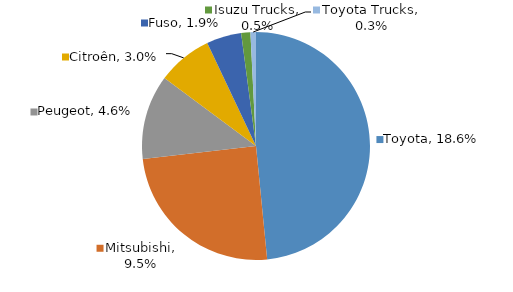
| Category | Series 0 |
|---|---|
| Toyota | 0.186 |
| Mitsubishi | 0.095 |
| Peugeot | 0.046 |
| Citroên | 0.03 |
| Fuso | 0.019 |
| Isuzu Trucks | 0.005 |
| Toyota Trucks | 0.003 |